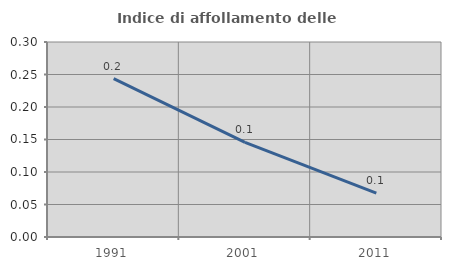
| Category | Indice di affollamento delle abitazioni  |
|---|---|
| 1991.0 | 0.244 |
| 2001.0 | 0.146 |
| 2011.0 | 0.067 |